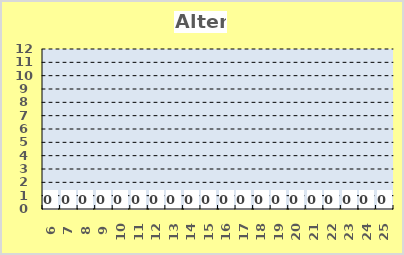
| Category | Series 0 |
|---|---|
| 6.0 | 0 |
| 7.0 | 0 |
| 8.0 | 0 |
| 9.0 | 0 |
| 10.0 | 0 |
| 11.0 | 0 |
| 12.0 | 0 |
| 13.0 | 0 |
| 14.0 | 0 |
| 15.0 | 0 |
| 16.0 | 0 |
| 17.0 | 0 |
| 18.0 | 0 |
| 19.0 | 0 |
| 20.0 | 0 |
| 21.0 | 0 |
| 22.0 | 0 |
| 23.0 | 0 |
| 24.0 | 0 |
| 25.0 | 0 |